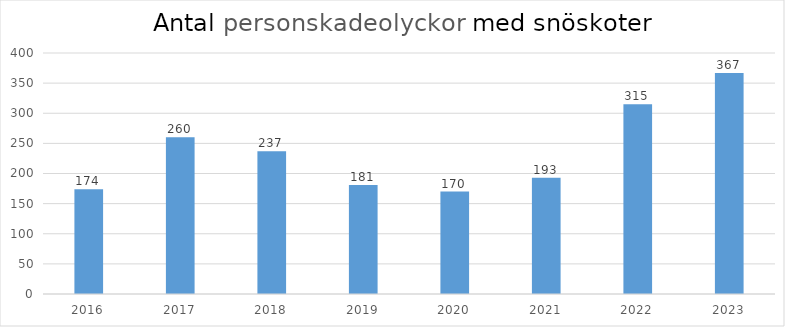
| Category | Total |
|---|---|
| 2016.0 | 174 |
| 2017.0 | 260 |
| 2018.0 | 237 |
| 2019.0 | 181 |
| 2020.0 | 170 |
| 2021.0 | 193 |
| 2022.0 | 315 |
| 2023.0 | 367 |